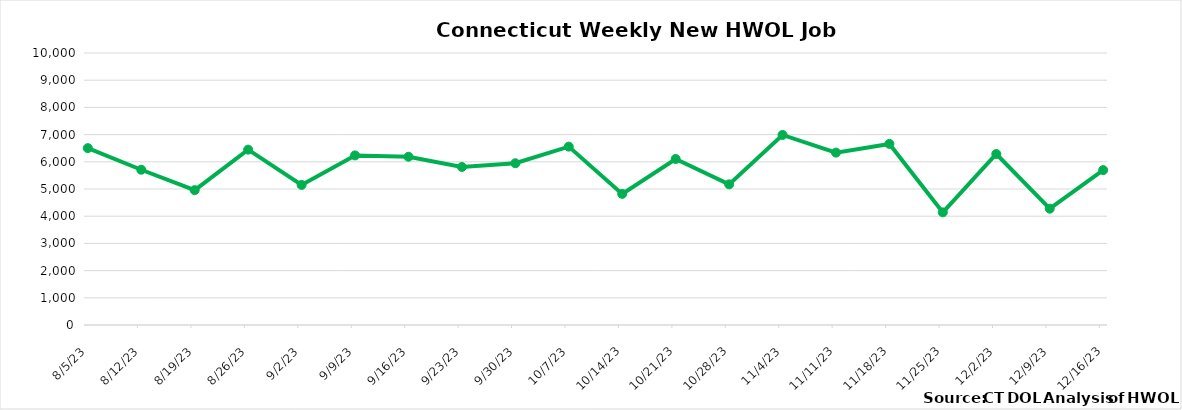
| Category | Connecticut |
|---|---|
| 8/5/23 | 6503 |
| 8/12/23 | 5708 |
| 8/19/23 | 4958 |
| 8/26/23 | 6447 |
| 9/2/23 | 5149 |
| 9/9/23 | 6235 |
| 9/16/23 | 6186 |
| 9/23/23 | 5810 |
| 9/30/23 | 5946 |
| 10/7/23 | 6558 |
| 10/14/23 | 4820 |
| 10/21/23 | 6103 |
| 10/28/23 | 5171 |
| 11/4/23 | 6987 |
| 11/11/23 | 6338 |
| 11/18/23 | 6658 |
| 11/25/23 | 4141 |
| 12/2/23 | 6286 |
| 12/9/23 | 4276 |
| 12/16/23 | 5695 |